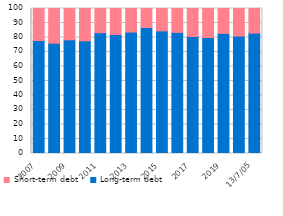
| Category | Long-term debt | Short-term debt |
|---|---|---|
| 2007 | 77.884 | 22.116 |
| 2008 | 76.082 | 23.918 |
| 2009 | 78.418 | 21.582 |
| 2010 | 77.751 | 22.249 |
| 2011 | 83.33 | 16.67 |
| 2012 | 82.063 | 17.937 |
| 2013 | 83.759 | 16.241 |
| 2014 | 86.878 | 13.122 |
| 2015 | 84.569 | 15.431 |
| 2016 | 83.543 | 16.457 |
| 2017 | 80.686 | 19.314 |
| 2018 | 79.973 | 20.027 |
| 2019 | 82.82 | 17.18 |
| 2020 | 80.989 | 19.011 |
| 2021 | 83.029 | 16.971 |